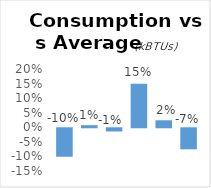
| Category | Series 0 |
|---|---|
| 0 | -0.098 |
| 1 | 0.007 |
| 2 | -0.011 |
| 3 | 0.149 |
| 4 | 0.024 |
| 5 | -0.072 |